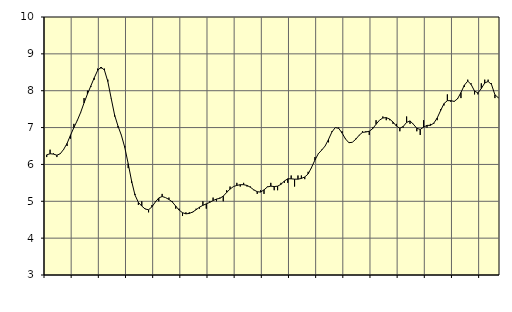
| Category | Piggar | Byggverksamhet, SNI 41-43 |
|---|---|---|
| nan | 6.2 | 6.26 |
| 87.0 | 6.4 | 6.29 |
| 87.0 | 6.3 | 6.28 |
| 87.0 | 6.2 | 6.25 |
| nan | 6.3 | 6.29 |
| 88.0 | 6.4 | 6.41 |
| 88.0 | 6.5 | 6.57 |
| 88.0 | 6.7 | 6.79 |
| nan | 7.1 | 7 |
| 89.0 | 7.2 | 7.19 |
| 89.0 | 7.4 | 7.41 |
| 89.0 | 7.8 | 7.67 |
| nan | 8 | 7.91 |
| 90.0 | 8.1 | 8.13 |
| 90.0 | 8.3 | 8.35 |
| 90.0 | 8.6 | 8.55 |
| nan | 8.6 | 8.64 |
| 91.0 | 8.6 | 8.56 |
| 91.0 | 8.3 | 8.25 |
| 91.0 | 7.8 | 7.79 |
| nan | 7.3 | 7.34 |
| 92.0 | 7 | 7.04 |
| 92.0 | 6.8 | 6.79 |
| 92.0 | 6.5 | 6.46 |
| nan | 5.9 | 6.02 |
| 93.0 | 5.5 | 5.55 |
| 93.0 | 5.2 | 5.17 |
| 93.0 | 4.9 | 4.97 |
| nan | 5 | 4.87 |
| 94.0 | 4.8 | 4.79 |
| 94.0 | 4.7 | 4.77 |
| 94.0 | 4.9 | 4.85 |
| nan | 5 | 4.98 |
| 95.0 | 5 | 5.09 |
| 95.0 | 5.2 | 5.13 |
| 95.0 | 5.1 | 5.1 |
| nan | 5.1 | 5.05 |
| 96.0 | 5 | 4.98 |
| 96.0 | 4.8 | 4.87 |
| 96.0 | 4.8 | 4.76 |
| nan | 4.6 | 4.69 |
| 97.0 | 4.7 | 4.66 |
| 97.0 | 4.7 | 4.67 |
| 97.0 | 4.7 | 4.71 |
| nan | 4.8 | 4.77 |
| 98.0 | 4.8 | 4.84 |
| 98.0 | 5 | 4.89 |
| 98.0 | 4.8 | 4.93 |
| nan | 5 | 4.97 |
| 99.0 | 5.1 | 5.02 |
| 99.0 | 5 | 5.06 |
| 99.0 | 5.1 | 5.08 |
| nan | 5 | 5.14 |
| 0.0 | 5.3 | 5.24 |
| 0.0 | 5.4 | 5.33 |
| 0.0 | 5.4 | 5.4 |
| nan | 5.5 | 5.43 |
| 1.0 | 5.4 | 5.45 |
| 1.0 | 5.5 | 5.45 |
| 1.0 | 5.4 | 5.43 |
| nan | 5.4 | 5.38 |
| 2.0 | 5.3 | 5.31 |
| 2.0 | 5.2 | 5.26 |
| 2.0 | 5.3 | 5.25 |
| nan | 5.2 | 5.31 |
| 3.0 | 5.4 | 5.39 |
| 3.0 | 5.5 | 5.41 |
| 3.0 | 5.3 | 5.4 |
| nan | 5.3 | 5.41 |
| 4.0 | 5.5 | 5.46 |
| 4.0 | 5.5 | 5.55 |
| 4.0 | 5.5 | 5.61 |
| nan | 5.7 | 5.61 |
| 5.0 | 5.4 | 5.6 |
| 5.0 | 5.7 | 5.6 |
| 5.0 | 5.7 | 5.62 |
| nan | 5.6 | 5.66 |
| 6.0 | 5.8 | 5.74 |
| 6.0 | 5.9 | 5.92 |
| 6.0 | 6.2 | 6.12 |
| nan | 6.3 | 6.29 |
| 7.0 | 6.4 | 6.39 |
| 7.0 | 6.5 | 6.5 |
| 7.0 | 6.6 | 6.68 |
| nan | 6.9 | 6.88 |
| 8.0 | 7 | 7 |
| 8.0 | 7 | 6.98 |
| 8.0 | 6.9 | 6.85 |
| nan | 6.7 | 6.69 |
| 9.0 | 6.6 | 6.59 |
| 9.0 | 6.6 | 6.6 |
| 9.0 | 6.7 | 6.68 |
| nan | 6.8 | 6.79 |
| 10.0 | 6.9 | 6.87 |
| 10.0 | 6.9 | 6.88 |
| 10.0 | 6.8 | 6.9 |
| nan | 7 | 6.97 |
| 11.0 | 7.2 | 7.09 |
| 11.0 | 7.2 | 7.2 |
| 11.0 | 7.3 | 7.26 |
| nan | 7.2 | 7.27 |
| 12.0 | 7.2 | 7.23 |
| 12.0 | 7.1 | 7.15 |
| 12.0 | 7.1 | 7.04 |
| nan | 6.9 | 6.98 |
| 13.0 | 7 | 7.03 |
| 13.0 | 7.3 | 7.14 |
| 13.0 | 7.1 | 7.18 |
| nan | 7.1 | 7.09 |
| 14.0 | 6.9 | 6.98 |
| 14.0 | 6.8 | 6.95 |
| 14.0 | 7.2 | 7.01 |
| nan | 7 | 7.06 |
| 15.0 | 7.1 | 7.06 |
| 15.0 | 7.1 | 7.12 |
| 15.0 | 7.2 | 7.26 |
| nan | 7.5 | 7.46 |
| 16.0 | 7.6 | 7.65 |
| 16.0 | 7.9 | 7.73 |
| 16.0 | 7.7 | 7.73 |
| nan | 7.7 | 7.71 |
| 17.0 | 7.8 | 7.78 |
| 17.0 | 7.8 | 7.95 |
| 17.0 | 8.1 | 8.15 |
| nan | 8.3 | 8.26 |
| 18.0 | 8.2 | 8.17 |
| 18.0 | 7.9 | 7.99 |
| 18.0 | 7.9 | 7.94 |
| nan | 8.2 | 8.06 |
| 19.0 | 8.3 | 8.21 |
| 19.0 | 8.3 | 8.25 |
| 19.0 | 8.2 | 8.17 |
| nan | 7.8 | 7.89 |
| 20.0 | 7.8 | 7.81 |